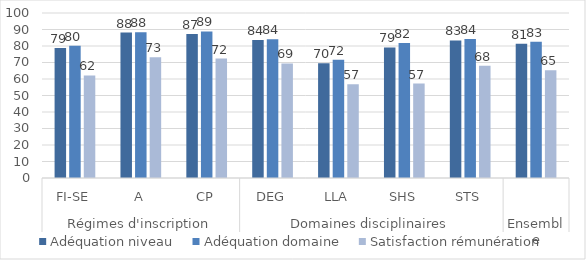
| Category | Adéquation niveau | Adéquation domaine | Satisfaction rémunération |
|---|---|---|---|
| 0 | 78.73 | 80.16 | 62.16 |
| 1 | 88.16 | 88.37 | 73.11 |
| 2 | 87.3 | 88.82 | 72.4 |
| 3 | 83.67 | 84.12 | 69.41 |
| 4 | 69.5 | 71.73 | 56.88 |
| 5 | 79.11 | 81.83 | 57.26 |
| 6 | 83.34 | 84.3 | 68 |
| 7 | 81.38 | 82.6 | 65.35 |